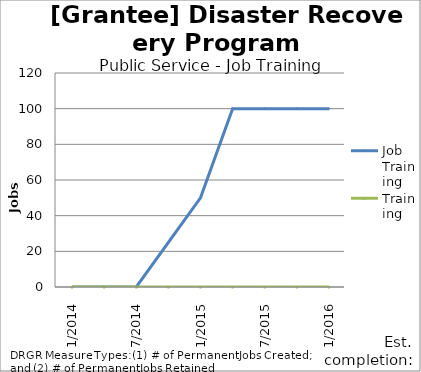
| Category | Job Training | Training |
|---|---|---|
| 1/2014 | 0 | 0 |
| 4/2014 | 0 | 0 |
| 7/2014 | 0 | 0 |
| 10/2014 | 25 | 0 |
| 1/2015 | 50 | 0 |
| 4/2015 | 100 | 0 |
| 7/2015 | 100 | 0 |
| 10/2015 | 100 | 0 |
| 1/2016 | 100 | 0 |